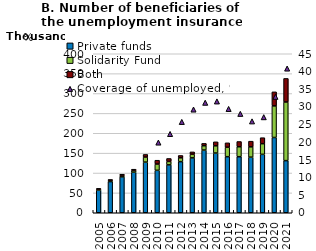
| Category | Private funds | Solidarity Fund | Both |
|---|---|---|---|
| 2005.0 | 57155 | 2433.167 | 1564.583 |
| 2006.0 | 78357.333 | 3135.417 | 2113 |
| 2007.0 | 90295.833 | 3737.5 | 2901.75 |
| 2008.0 | 102023.833 | 4385.5 | 3160.5 |
| 2009.0 | 127400 | 12841.5 | 6461.917 |
| 2010.0 | 106772.5 | 15825.083 | 9561.5 |
| 2011.0 | 120516.083 | 8649.917 | 7404.417 |
| 2012.0 | 128544.167 | 9679.167 | 5906.833 |
| 2013.0 | 138087.583 | 9318.167 | 5727.417 |
| 2014.0 | 157709.25 | 10906.167 | 5895.583 |
| 2015.0 | 150222.25 | 18193 | 10031.333 |
| 2016.0 | 141045.167 | 23889.25 | 10982.083 |
| 2017.0 | 140970.5 | 25030.583 | 13255.5 |
| 2018.0 | 139877.583 | 25947.917 | 14255.917 |
| 2019.0 | 146932.833 | 26842.333 | 15073.25 |
| 2020.0 | 189340.667 | 79503.5 | 35348.917 |
| 2021.0 | 131136.167 | 147533.667 | 59280.583 |